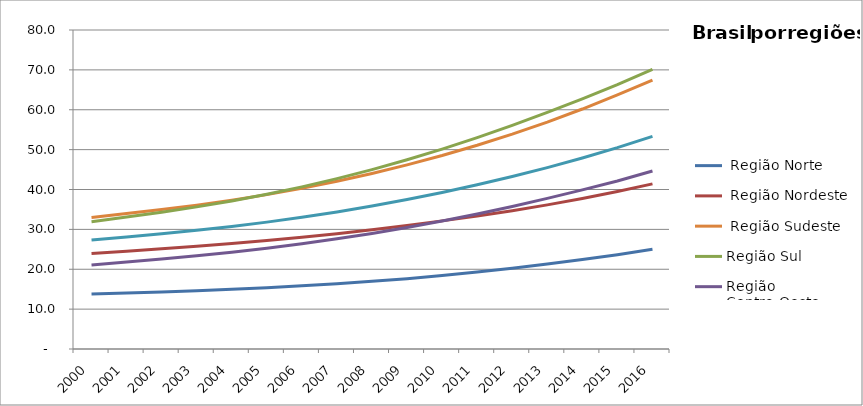
| Category |  Região Norte |  Região Nordeste |  Região Sudeste | Região Sul | Região Centro-Oeste | Total |
|---|---|---|---|---|---|---|
| 2000.0 | 13.77 | 23.95 | 32.962 | 31.934 | 21.077 | 27.32 |
| 2001.0 | 14.016 | 24.536 | 33.956 | 33.084 | 21.8 | 28.099 |
| 2002.0 | 14.296 | 25.135 | 34.981 | 34.31 | 22.553 | 28.908 |
| 2003.0 | 14.613 | 25.76 | 36.075 | 35.639 | 23.357 | 29.77 |
| 2004.0 | 14.974 | 26.439 | 37.304 | 37.123 | 24.25 | 30.73 |
| 2005.0 | 15.386 | 27.191 | 38.71 | 38.796 | 25.259 | 31.815 |
| 2006.0 | 15.853 | 28.018 | 40.295 | 40.66 | 26.383 | 33.029 |
| 2007.0 | 16.377 | 28.931 | 42.067 | 42.725 | 27.625 | 34.379 |
| 2008.0 | 16.969 | 29.925 | 44.03 | 44.993 | 28.99 | 35.866 |
| 2009.0 | 17.647 | 30.993 | 46.185 | 47.463 | 30.485 | 37.491 |
| 2010.0 | 18.42 | 32.132 | 48.537 | 50.133 | 32.109 | 39.255 |
| 2011.0 | 19.289 | 33.36 | 51.1 | 53.005 | 33.868 | 41.171 |
| 2012.0 | 20.253 | 34.691 | 53.888 | 56.078 | 35.759 | 43.247 |
| 2013.0 | 21.309 | 36.144 | 56.912 | 59.334 | 37.776 | 45.491 |
| 2014.0 | 22.445 | 37.741 | 60.183 | 62.745 | 39.904 | 47.909 |
| 2015.0 | 23.648 | 39.493 | 63.708 | 66.275 | 42.121 | 50.499 |
| 2016.0 | 25.003 | 41.417 | 67.432 | 70.151 | 44.637 | 53.311 |